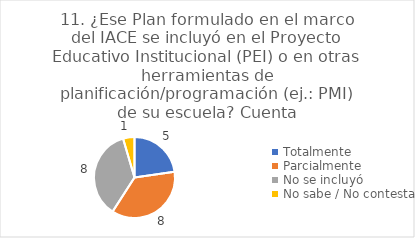
| Category | 11. ¿Ese Plan formulado en el marco del IACE se incluyó en el Proyecto Educativo Institucional (PEI) o en otras herramientas de planificación/programación (ej.: PMI) de su escuela? |
|---|---|
| Totalmente  | 0.227 |
| Parcialmente  | 0.364 |
| No se incluyó  | 0.364 |
| No sabe / No contesta | 0.045 |